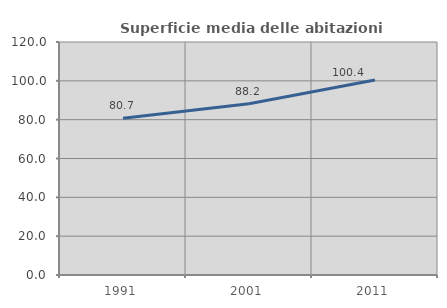
| Category | Superficie media delle abitazioni occupate |
|---|---|
| 1991.0 | 80.735 |
| 2001.0 | 88.214 |
| 2011.0 | 100.389 |